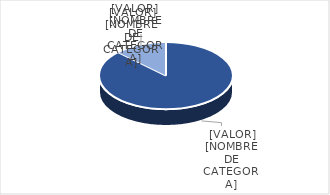
| Category | Series 0 |
|---|---|
| PRESUPUESTO VIGENTE PARA 2023 | 25000000 |
| PRESUPUESTO EJECUTADO  | 3644574.37 |
| PORCENTAJE DE EJECUCIÓN  | 0.146 |